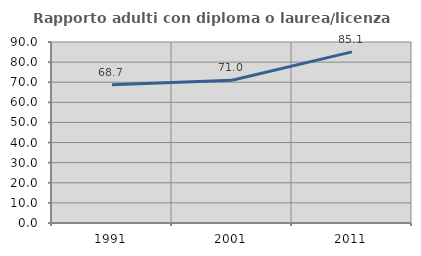
| Category | Rapporto adulti con diploma o laurea/licenza media  |
|---|---|
| 1991.0 | 68.687 |
| 2001.0 | 70.968 |
| 2011.0 | 85.079 |